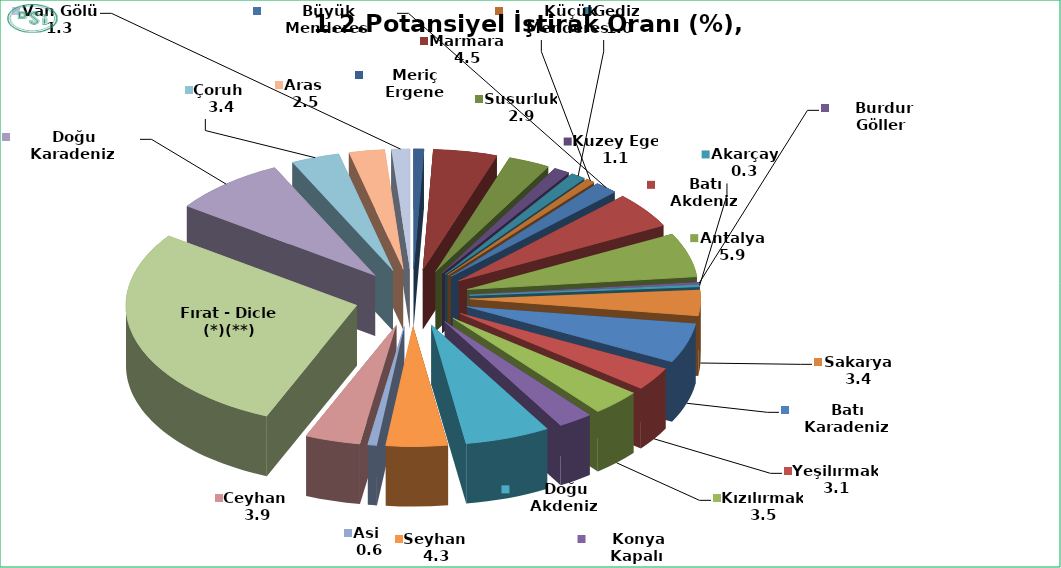
| Category | Potansiyel İştirak Oranı (%) |
|---|---|
| Meriç Ergene | 0.715 |
| Marmara  | 4.477 |
| Susurluk  | 2.919 |
| Kuzey Ege  | 1.123 |
| Gediz  | 1.048 |
| Küçük Menderes  | 0.64 |
| Büyük Menderes  | 1.629 |
| Batı Akdeniz  | 4.8 |
| Antalya  | 5.945 |
| Burdur Göller  | 0.269 |
| Akarçay  | 0.263 |
| Sakarya  | 3.44 |
| Batı Karadeniz  | 5.337 |
| Yeşilırmak  | 3.117 |
| Kızılırmak  | 3.483 |
| Konya Kapalı  | 2.429 |
| Doğu Akdeniz  | 5.95 |
| Seyhan  | 4.305 |
| Asi  | 0.629 |
| Ceyhan  | 3.859 |
| Fırat - Dicle (*)(**) | 28.455 |
| Doğu Karadeniz  | 8.009 |
| Çoruh  | 3.386 |
| Aras  | 2.489 |
| Van Gölü  | 1.285 |